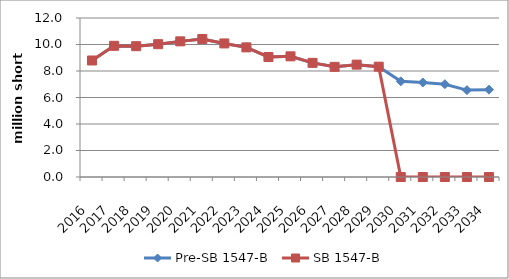
| Category | Pre-SB 1547-B | SB 1547-B |
|---|---|---|
| 2016.0 | 8.794 | 8.794 |
| 2017.0 | 9.901 | 9.901 |
| 2018.0 | 9.872 | 9.872 |
| 2019.0 | 10.024 | 10.024 |
| 2020.0 | 10.237 | 10.237 |
| 2021.0 | 10.415 | 10.415 |
| 2022.0 | 10.08 | 10.08 |
| 2023.0 | 9.784 | 9.784 |
| 2024.0 | 9.058 | 9.058 |
| 2025.0 | 9.107 | 9.107 |
| 2026.0 | 8.615 | 8.615 |
| 2027.0 | 8.313 | 8.313 |
| 2028.0 | 8.48 | 8.48 |
| 2029.0 | 8.327 | 8.327 |
| 2030.0 | 7.22 | 0 |
| 2031.0 | 7.133 | 0 |
| 2032.0 | 7.005 | 0 |
| 2033.0 | 6.557 | 0 |
| 2034.0 | 6.591 | 0 |